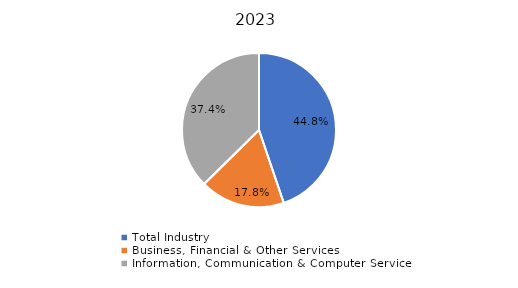
| Category | Series 0 |
|---|---|
| Total Industry | 0.448 |
| Business, Financial & Other Services | 0.178 |
| Information, Communication & Computer Services | 0.374 |